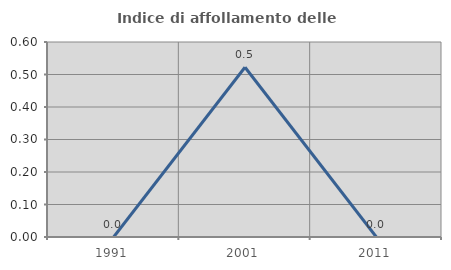
| Category | Indice di affollamento delle abitazioni  |
|---|---|
| 1991.0 | 0 |
| 2001.0 | 0.522 |
| 2011.0 | 0 |